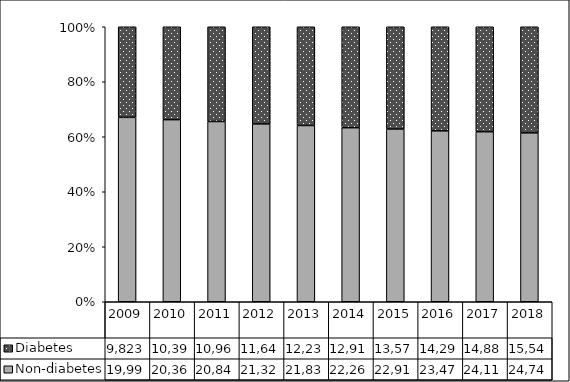
| Category | Non-diabetes | Diabetes |
|---|---|---|
| 2009.0 | 19998 | 9823 |
| 2010.0 | 20369 | 10391 |
| 2011.0 | 20846 | 10960 |
| 2012.0 | 21321 | 11640 |
| 2013.0 | 21836 | 12234 |
| 2014.0 | 22269 | 12919 |
| 2015.0 | 22915 | 13572 |
| 2016.0 | 23478 | 14292 |
| 2017.0 | 24113 | 14885 |
| 2018.0 | 24746 | 15543 |